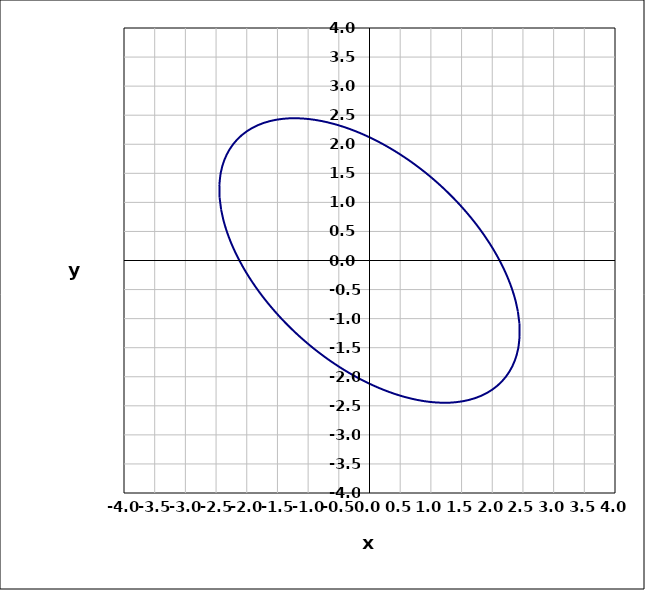
| Category | Series 0 |
|---|---|
| -2.1198109374024336 | 0 |
| -2.0447016706972927 | -0.143 |
| -1.967946894436288 | -0.277 |
| -1.8901759599401304 | -0.402 |
| -1.8117590212131809 | -0.52 |
| -1.7328733067479565 | -0.631 |
| -1.6535522420862672 | -0.736 |
| -1.5737208387490984 | -0.837 |
| -1.4932204519403325 | -0.933 |
| -1.4118254540815995 | -1.026 |
| -1.3292538012848067 | -1.115 |
| -1.2451729771376363 | -1.202 |
| -1.1592024094601405 | -1.287 |
| -1.0709131711268107 | -1.371 |
| -0.9798255889116493 | -1.453 |
| -0.8854052911963288 | -1.534 |
| -0.7870582320981756 | -1.614 |
| -0.6841253557901295 | -1.693 |
| -0.5758778489467542 | -1.772 |
| -0.46151443428494554 | -1.851 |
| -0.3401629768168356 | -1.929 |
| -0.21088992994657332 | -2.006 |
| -0.07272297977823111 | -2.083 |
| 0.07530524712455595 | -2.156 |
| 0.23408144447023457 | -2.227 |
| 0.4042897507137245 | -2.293 |
| 0.5862280591699284 | -2.351 |
| 0.7795502574053667 | -2.399 |
| 0.9829364704087287 | -2.433 |
| 1.1937261418149394 | -2.448 |
| 1.4076039214764917 | -2.438 |
| 1.6184941250930711 | -2.4 |
| 1.818854033591324 | -2.328 |
| 2.000491510584625 | -2.222 |
| 2.155827346064283 | -2.082 |
| 2.279249912516888 | -1.913 |
| 2.368065585486026 | -1.721 |
| 2.4226927216255763 | -1.514 |
| 2.4461076918292926 | -1.301 |
| 2.44286614193248 | -1.088 |
| 2.4180987636861206 | -0.88 |
| 2.376748180985734 | -0.682 |
| 2.323125845145846 | -0.494 |
| 2.260739898065359 | -0.318 |
| 2.192299721213839 | -0.153 |
| 2.119810937402434 | 0 |
| 2.0447016706972927 | 0.143 |
| 1.9679468944362875 | 0.277 |
| 1.8901759599401304 | 0.402 |
| 1.8117590212131809 | 0.52 |
| 1.7328733067479567 | 0.631 |
| 1.6535522420862665 | 0.736 |
| 1.5737208387490984 | 0.837 |
| 1.4932204519403325 | 0.933 |
| 1.4118254540816 | 1.026 |
| 1.3292538012848067 | 1.115 |
| 1.2451729771376365 | 1.202 |
| 1.1592024094601412 | 1.287 |
| 1.070913171126811 | 1.371 |
| 0.9798255889116497 | 1.453 |
| 0.8854052911963294 | 1.534 |
| 0.7870582320981755 | 1.614 |
| 0.6841253557901297 | 1.693 |
| 0.5758778489467544 | 1.772 |
| 0.4615144342849456 | 1.851 |
| 0.3401629768168358 | 1.929 |
| 0.21088992994657355 | 2.006 |
| 0.07272297977823185 | 2.083 |
| -0.07530524712455518 | 2.156 |
| -0.2340814444702343 | 2.227 |
| -0.40428975071372425 | 2.293 |
| -0.5862280591699282 | 2.351 |
| -0.7795502574053663 | 2.399 |
| -0.9829364704087284 | 2.433 |
| -1.1937261418149399 | 2.448 |
| -1.4076039214764904 | 2.438 |
| -1.6184941250930707 | 2.4 |
| -1.818854033591324 | 2.328 |
| -2.000491510584624 | 2.222 |
| -2.155827346064282 | 2.082 |
| -2.2792499125168875 | 1.913 |
| -2.3680655854860255 | 1.721 |
| -2.4226927216255763 | 1.514 |
| -2.4461076918292926 | 1.301 |
| -2.4428661419324804 | 1.088 |
| -2.4180987636861206 | 0.88 |
| -2.376748180985734 | 0.682 |
| -2.323125845145846 | 0.494 |
| -2.260739898065359 | 0.318 |
| -2.1922997212138395 | 0.153 |
| -2.119810937402434 | 0 |